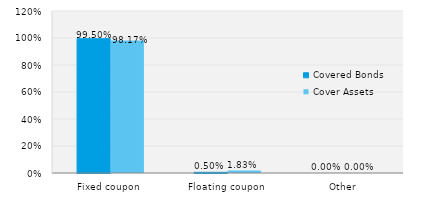
| Category | Covered Bonds | Cover Assets |
|---|---|---|
| Fixed coupon | 0.995 | 0.982 |
| Floating coupon | 0.005 | 0.018 |
| Other | 0 | 0 |